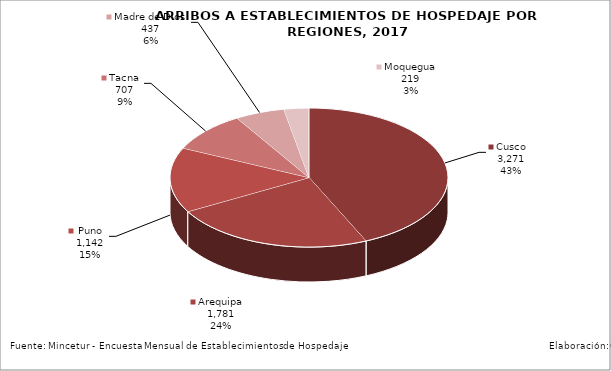
| Category | Series 0 |
|---|---|
| Cusco | 3270.803 |
| Arequipa | 1781.324 |
| Puno | 1142.442 |
| Tacna | 706.918 |
| Madre de Dios | 436.694 |
| Moquegua | 218.88 |